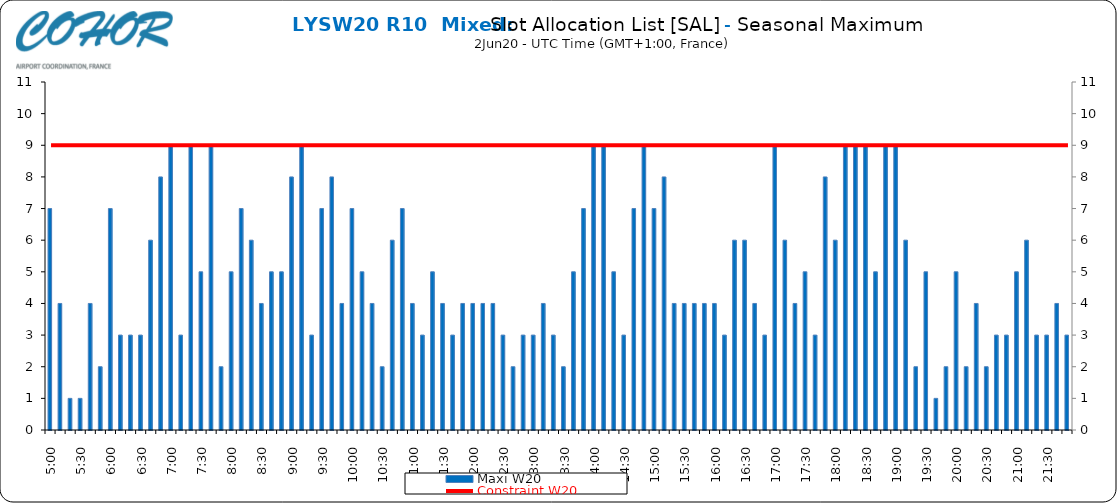
| Category | Maxi W20 |
|---|---|
| 0.20833333333333334 | 7 |
| 0.2152777777777778 | 4 |
| 0.2222222222222222 | 1 |
| 0.22916666666666666 | 1 |
| 0.23611111111111113 | 4 |
| 0.24305555555555555 | 2 |
| 0.25 | 7 |
| 0.2569444444444445 | 3 |
| 0.2638888888888889 | 3 |
| 0.2708333333333333 | 3 |
| 0.2777777777777778 | 6 |
| 0.2847222222222222 | 8 |
| 0.2916666666666667 | 9 |
| 0.2986111111111111 | 3 |
| 0.3055555555555555 | 9 |
| 0.3125 | 5 |
| 0.3194444444444445 | 9 |
| 0.3263888888888889 | 2 |
| 0.3333333333333333 | 5 |
| 0.34027777777777773 | 7 |
| 0.34722222222222227 | 6 |
| 0.3541666666666667 | 4 |
| 0.3611111111111111 | 5 |
| 0.3680555555555556 | 5 |
| 0.375 | 8 |
| 0.3819444444444444 | 9 |
| 0.3888888888888889 | 3 |
| 0.3958333333333333 | 7 |
| 0.40277777777777773 | 8 |
| 0.40972222222222227 | 4 |
| 0.4166666666666667 | 7 |
| 0.4236111111111111 | 5 |
| 0.4305555555555556 | 4 |
| 0.4375 | 2 |
| 0.4444444444444444 | 6 |
| 0.4513888888888889 | 7 |
| 0.4583333333333333 | 4 |
| 0.46527777777777773 | 3 |
| 0.47222222222222227 | 5 |
| 0.4791666666666667 | 4 |
| 0.4861111111111111 | 3 |
| 0.4930555555555556 | 4 |
| 0.5 | 4 |
| 0.5069444444444444 | 4 |
| 0.513888888888889 | 4 |
| 0.5208333333333334 | 3 |
| 0.5277777777777778 | 2 |
| 0.5347222222222222 | 3 |
| 0.5416666666666666 | 3 |
| 0.548611111111111 | 4 |
| 0.5555555555555556 | 3 |
| 0.5625 | 2 |
| 0.5694444444444444 | 5 |
| 0.576388888888889 | 7 |
| 0.5833333333333334 | 9 |
| 0.5902777777777778 | 9 |
| 0.5972222222222222 | 5 |
| 0.6041666666666666 | 3 |
| 0.611111111111111 | 7 |
| 0.6180555555555556 | 9 |
| 0.625 | 7 |
| 0.6319444444444444 | 8 |
| 0.638888888888889 | 4 |
| 0.6458333333333334 | 4 |
| 0.6527777777777778 | 4 |
| 0.6597222222222222 | 4 |
| 0.6666666666666666 | 4 |
| 0.6736111111111112 | 3 |
| 0.6805555555555555 | 6 |
| 0.6875 | 6 |
| 0.6944444444444445 | 4 |
| 0.7013888888888888 | 3 |
| 0.7083333333333334 | 9 |
| 0.7152777777777778 | 6 |
| 0.7222222222222222 | 4 |
| 0.7291666666666666 | 5 |
| 0.7361111111111112 | 3 |
| 0.7430555555555555 | 8 |
| 0.75 | 6 |
| 0.7569444444444445 | 9 |
| 0.7638888888888888 | 9 |
| 0.7708333333333334 | 9 |
| 0.7777777777777778 | 5 |
| 0.7847222222222222 | 9 |
| 0.7916666666666666 | 9 |
| 0.7986111111111112 | 6 |
| 0.8055555555555555 | 2 |
| 0.8125 | 5 |
| 0.8194444444444445 | 1 |
| 0.8263888888888888 | 2 |
| 0.8333333333333334 | 5 |
| 0.8402777777777778 | 2 |
| 0.8472222222222222 | 4 |
| 0.8541666666666666 | 2 |
| 0.8611111111111112 | 3 |
| 0.8680555555555555 | 3 |
| 0.875 | 5 |
| 0.8819444444444445 | 6 |
| 0.8888888888888888 | 3 |
| 0.8958333333333334 | 3 |
| 0.9027777777777778 | 4 |
| 0.9097222222222222 | 3 |